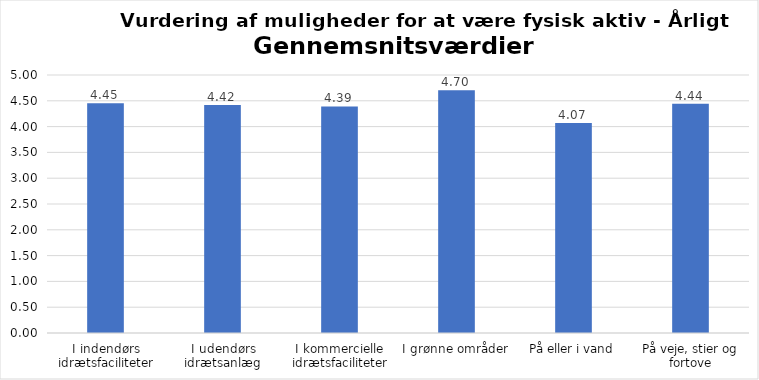
| Category | Gennemsnit |
|---|---|
| I indendørs idrætsfaciliteter | 4.45 |
| I udendørs idrætsanlæg | 4.417 |
| I kommercielle idrætsfaciliteter | 4.39 |
| I grønne områder | 4.704 |
| På eller i vand | 4.071 |
| På veje, stier og fortove | 4.441 |